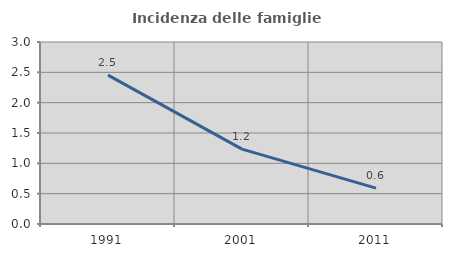
| Category | Incidenza delle famiglie numerose |
|---|---|
| 1991.0 | 2.454 |
| 2001.0 | 1.235 |
| 2011.0 | 0.592 |